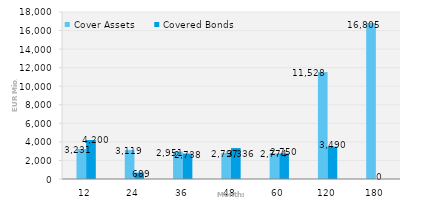
| Category | Cover Assets | Covered Bonds |
|---|---|---|
| 12.0 | 3230.854 | 4200 |
| 24.0 | 3118.784 | 689.444 |
| 36.0 | 2951.148 | 2738 |
| 48.0 | 2797.341 | 3336.41 |
| 60.0 | 2773.533 | 2750 |
| 120.0 | 11528.127 | 3490 |
| 180.0 | 16804.988 | 0 |